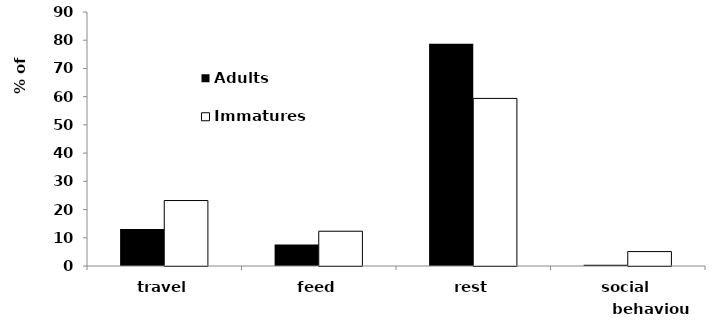
| Category | Adults | Immatures |
|---|---|---|
| travel | 13.09 | 23.19 |
| feed | 7.65 | 12.32 |
| rest | 78.79 | 59.38 |
| social | 0.47 | 5.11 |